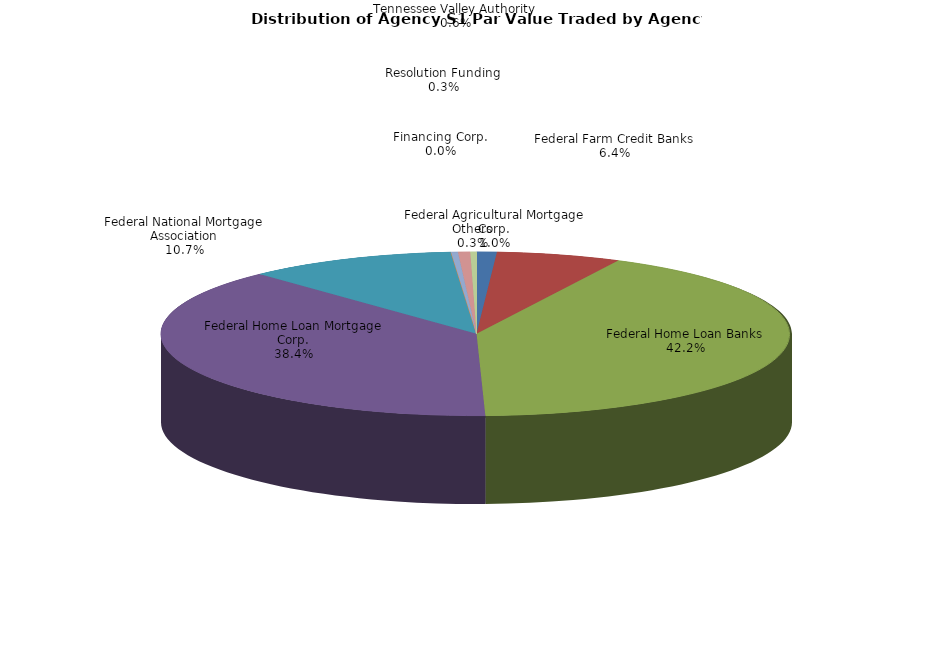
| Category | Series 0 |
|---|---|
| Federal Agricultural Mortgage Corp. | 29163306.773 |
| Federal Farm Credit Banks | 179951541.833 |
| Federal Home Loan Banks | 1192978135.219 |
| Federal Home Loan Mortgage Corp. | 1087014158.895 |
| Federal National Mortgage Association | 303841564.361 |
| Financing Corp. | 0 |
| Resolution Funding | 9899211.155 |
| Tennessee Valley Authority | 17546646.895 |
| Others | 8919057.051 |